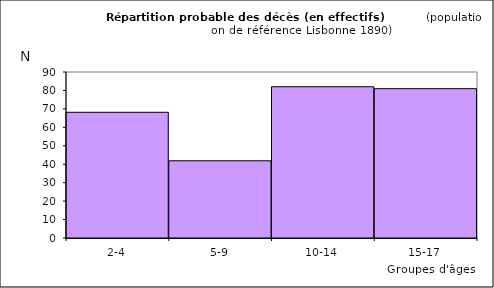
| Category | Series 0 |
|---|---|
| 2-4 | 68.16 |
| 5-9 | 41.865 |
| 10-14 | 82.013 |
| 15-17 | 80.962 |